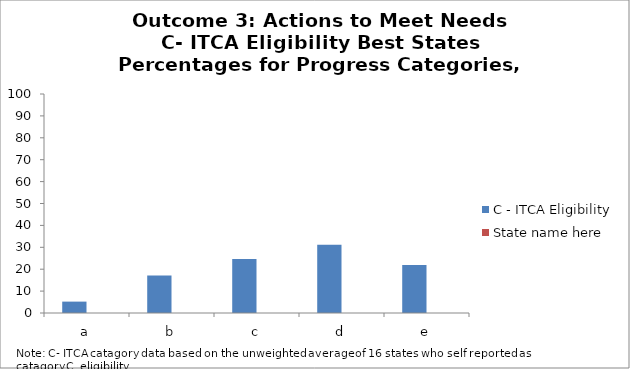
| Category | C - ITCA Eligibility | State name here |
|---|---|---|
| a | 5.2 |  |
| b | 17.1 |  |
| c | 24.7 |  |
| d | 31.2 |  |
| e | 21.9 |  |